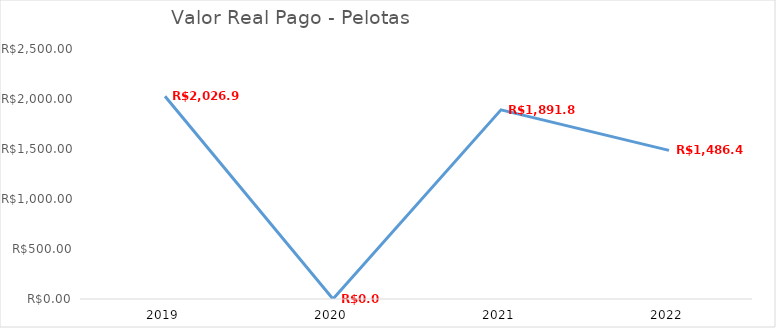
| Category | Series 0 |
|---|---|
| 2019.0 | 2026.95 |
| 2020.0 | 0 |
| 2021.0 | 1891.82 |
| 2022.0 | 1486.43 |